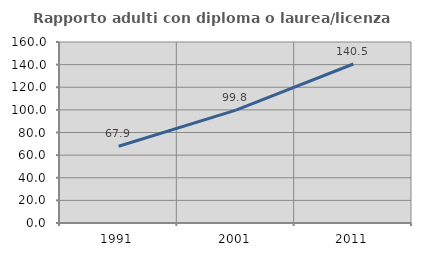
| Category | Rapporto adulti con diploma o laurea/licenza media  |
|---|---|
| 1991.0 | 67.863 |
| 2001.0 | 99.826 |
| 2011.0 | 140.539 |